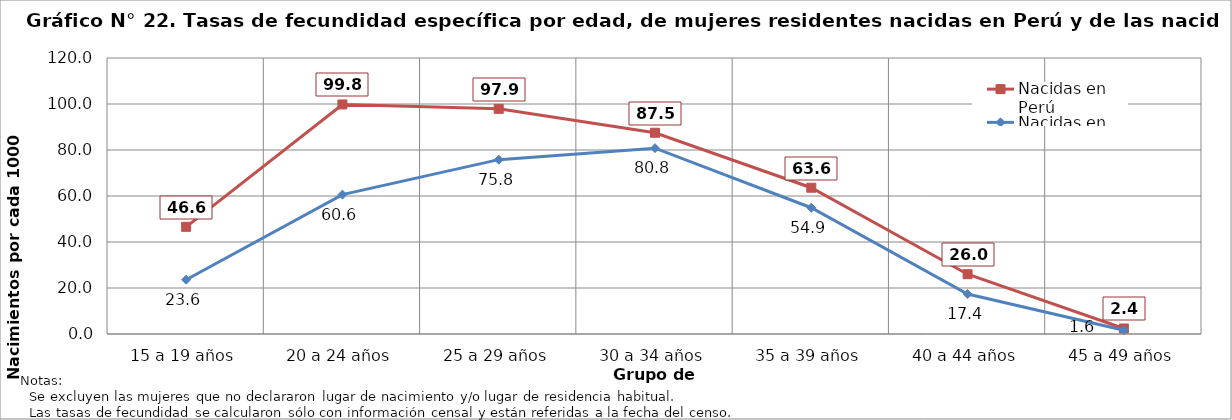
| Category | Nacidas en Perú | Nacidas en Chile |
|---|---|---|
| 15 a 19 años | 46.6 | 23.6 |
| 20 a 24 años | 99.8 | 60.6 |
| 25 a 29 años | 97.9 | 75.8 |
| 30 a 34 años | 87.5 | 80.8 |
| 35 a 39 años | 63.6 | 54.9 |
| 40 a 44 años | 26 | 17.4 |
| 45 a 49 años | 2.4 | 1.6 |